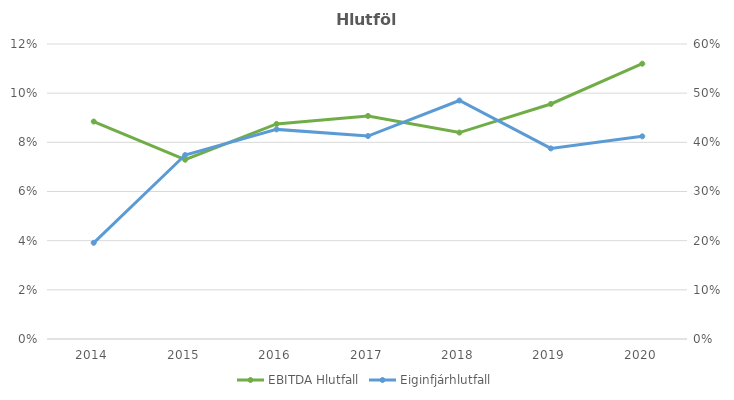
| Category | EBITDA Hlutfall |
|---|---|
| 2014.0 | 0.088 |
| 2015.0 | 0.073 |
| 2016.0 | 0.087 |
| 2017.0 | 0.091 |
| 2018.0 | 0.084 |
| 2019.0 | 0.096 |
| 2020.0 | 0.112 |